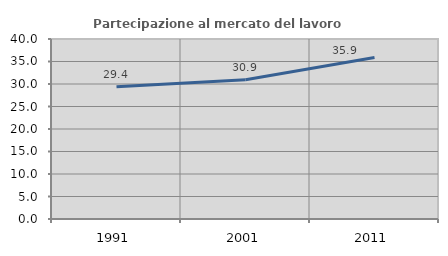
| Category | Partecipazione al mercato del lavoro  femminile |
|---|---|
| 1991.0 | 29.412 |
| 2001.0 | 30.935 |
| 2011.0 | 35.878 |